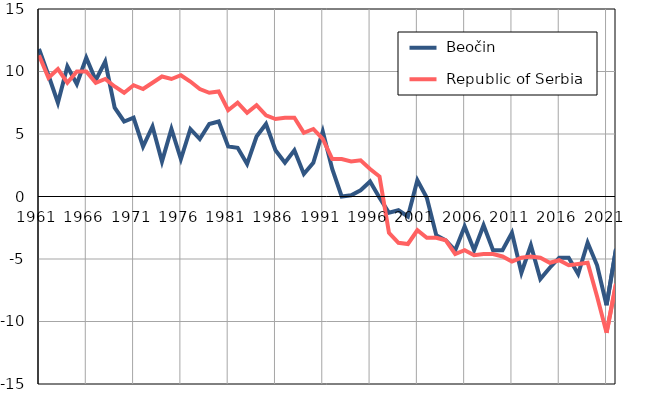
| Category |  Beočin |  Republic of Serbia |
|---|---|---|
| 1961.0 | 11.8 | 11.3 |
| 1962.0 | 9.7 | 9.5 |
| 1963.0 | 7.5 | 10.2 |
| 1964.0 | 10.4 | 9.1 |
| 1965.0 | 9 | 10 |
| 1966.0 | 11.1 | 10 |
| 1967.0 | 9.3 | 9.1 |
| 1968.0 | 10.8 | 9.4 |
| 1969.0 | 7.1 | 8.8 |
| 1970.0 | 6 | 8.3 |
| 1971.0 | 6.3 | 8.9 |
| 1972.0 | 4 | 8.6 |
| 1973.0 | 5.6 | 9.1 |
| 1974.0 | 2.8 | 9.6 |
| 1975.0 | 5.4 | 9.4 |
| 1976.0 | 3 | 9.7 |
| 1977.0 | 5.4 | 9.2 |
| 1978.0 | 4.6 | 8.6 |
| 1979.0 | 5.8 | 8.3 |
| 1980.0 | 6 | 8.4 |
| 1981.0 | 4 | 6.9 |
| 1982.0 | 3.9 | 7.5 |
| 1983.0 | 2.6 | 6.7 |
| 1984.0 | 4.8 | 7.3 |
| 1985.0 | 5.8 | 6.5 |
| 1986.0 | 3.7 | 6.2 |
| 1987.0 | 2.7 | 6.3 |
| 1988.0 | 3.7 | 6.3 |
| 1989.0 | 1.8 | 5.1 |
| 1990.0 | 2.7 | 5.4 |
| 1991.0 | 5.2 | 4.6 |
| 1992.0 | 2.2 | 3 |
| 1993.0 | 0 | 3 |
| 1994.0 | 0.1 | 2.8 |
| 1995.0 | 0.5 | 2.9 |
| 1996.0 | 1.2 | 2.2 |
| 1997.0 | -0.1 | 1.6 |
| 1998.0 | -1.3 | -2.9 |
| 1999.0 | -1.1 | -3.7 |
| 2000.0 | -1.6 | -3.8 |
| 2001.0 | 1.3 | -2.7 |
| 2002.0 | -0.1 | -3.3 |
| 2003.0 | -3.1 | -3.3 |
| 2004.0 | -3.5 | -3.5 |
| 2005.0 | -4.3 | -4.6 |
| 2006.0 | -2.4 | -4.3 |
| 2007.0 | -4.3 | -4.7 |
| 2008.0 | -2.3 | -4.6 |
| 2009.0 | -4.3 | -4.6 |
| 2010.0 | -4.3 | -4.8 |
| 2011.0 | -2.9 | -5.2 |
| 2012.0 | -6.1 | -4.9 |
| 2013.0 | -3.9 | -4.8 |
| 2014.0 | -6.6 | -4.9 |
| 2015.0 | -5.7 | -5.3 |
| 2016.0 | -4.9 | -5.1 |
| 2017.0 | -4.9 | -5.5 |
| 2018.0 | -6.2 | -5.4 |
| 2019.0 | -3.7 | -5.3 |
| 2020.0 | -5.5 | -8 |
| 2021.0 | -8.7 | -10.9 |
| 2022.0 | -4.2 | -7 |